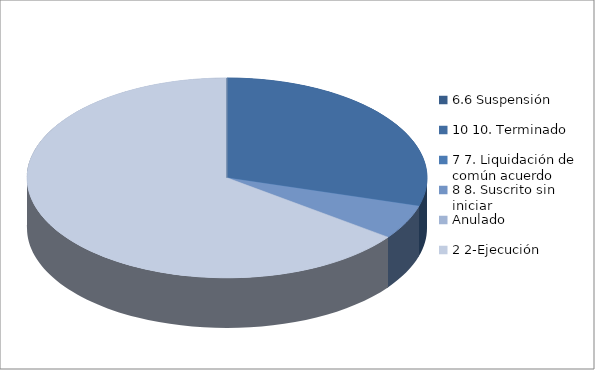
| Category | Series 0 |
|---|---|
| 6.6 Suspensión | 0 |
| 10 10. Terminado | 154 |
| 7 7. Liquidación de común acuerdo | 0 |
| 8 8. Suscrito sin iniciar | 29 |
| Anulado | 0 |
| 2 2-Ejecución | 338 |